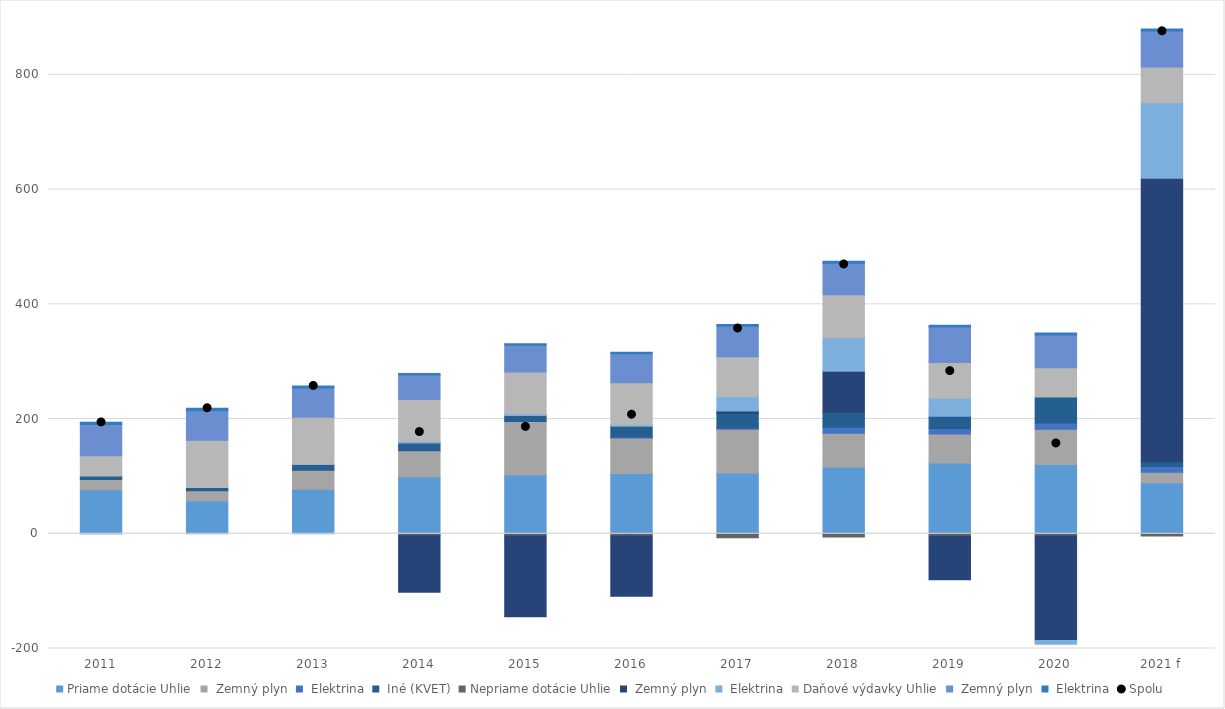
| Category | Priame dotácie | Nepriame dotácie | Daňové výdavky |
|---|---|---|---|
| 2011 | 6.101 | -0.099 | 3.791 |
| 2012 | 5.503 | 0 | 4.161 |
| 2013 | 10.527 | 0 | 3.714 |
| 2014 | 13.199 | 2.608 | 2.429 |
| 2015 | 10.461 | 2.742 | 2.471 |
| 2016 | 18.459 | 2.842 | 2.65 |
| 2017 | 25.671 | 24.909 | 2.934 |
| 2018 | 26.137 | 58.497 | 3.149 |
| 2019 | 21.387 | 31.327 | 3.12 |
| 2020 | 45.308 | -6.533 | 3.254 |
| 2021 f | 8.002 | 131.249 | 3.587 |